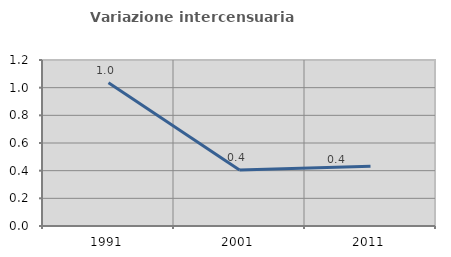
| Category | Variazione intercensuaria annua |
|---|---|
| 1991.0 | 1.035 |
| 2001.0 | 0.405 |
| 2011.0 | 0.432 |